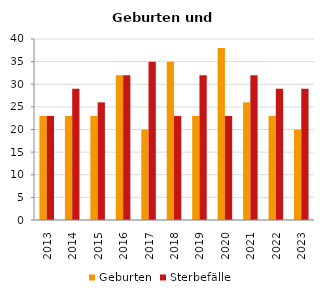
| Category | Geburten | Sterbefälle |
|---|---|---|
| 2013.0 | 23 | 23 |
| 2014.0 | 23 | 29 |
| 2015.0 | 23 | 26 |
| 2016.0 | 32 | 32 |
| 2017.0 | 20 | 35 |
| 2018.0 | 35 | 23 |
| 2019.0 | 23 | 32 |
| 2020.0 | 38 | 23 |
| 2021.0 | 26 | 32 |
| 2022.0 | 23 | 29 |
| 2023.0 | 20 | 29 |